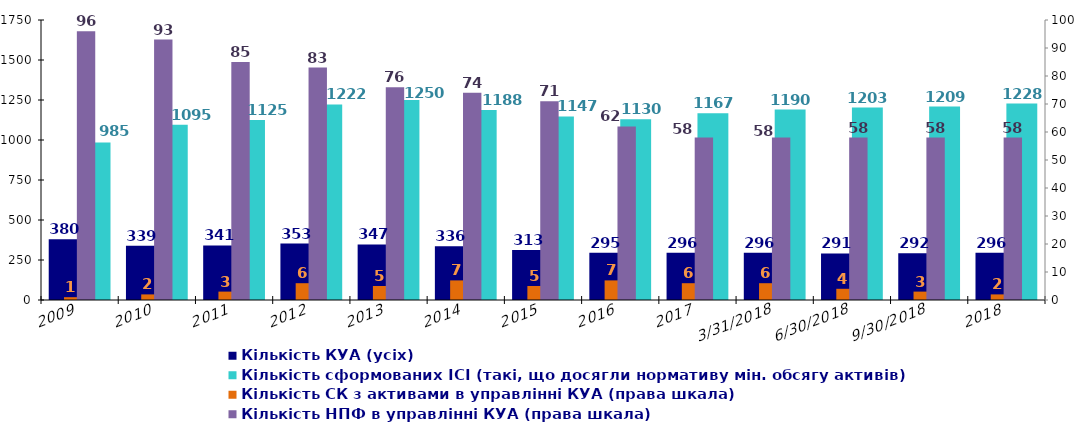
| Category | Кількість зареєстрованих ІСІ на одну КУА | Кількість КУА (усіх) | Кількість КУА з ІСІ в управлінні | Кількість сформованих ІСІ (такі, що досягли нормативу мін. обсягу активів)  |
|---|---|---|---|---|
| 2009 |  | 380 |  | 985 |
| 2010 |  | 339 |  | 1095 |
| 2011 |  | 341 |  | 1125 |
| 2012 |  | 353 |  | 1222 |
| 2013 |  | 347 |  | 1250 |
| 2014 |  | 336 |  | 1188 |
| 2015 |  | 313 |  | 1147 |
| 2016 |  | 295 |  | 1130 |
| 2017 |  | 296 |  | 1167 |
| 31.03.2018 |  | 296 |  | 1190 |
| 30.06.2018 |  | 291 |  | 1203 |
| 30.09.2018 |  | 292 |  | 1209 |
| 2018 |  | 296 |  | 1228 |